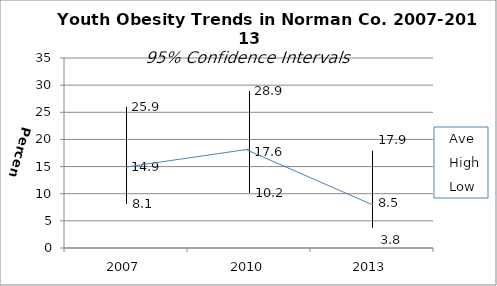
| Category | Ave | High | Low |
|---|---|---|---|
| 2007.0 | 14.9 | 25.9 | 8.1 |
| 2010.0 | 17.6 | 28.9 | 10.2 |
| 2013.0 | 8.5 | 17.9 | 3.8 |